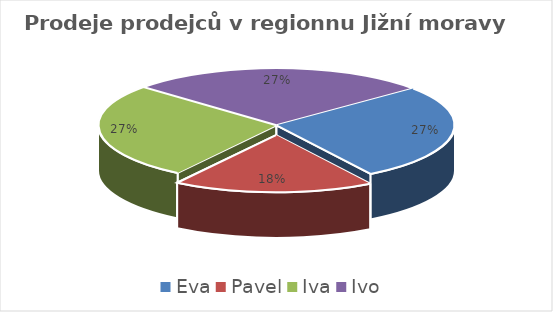
| Category | Prodeje (ks) |
|---|---|
| Eva | 30 |
| Pavel | 20 |
| Iva | 30 |
| Ivo | 30 |